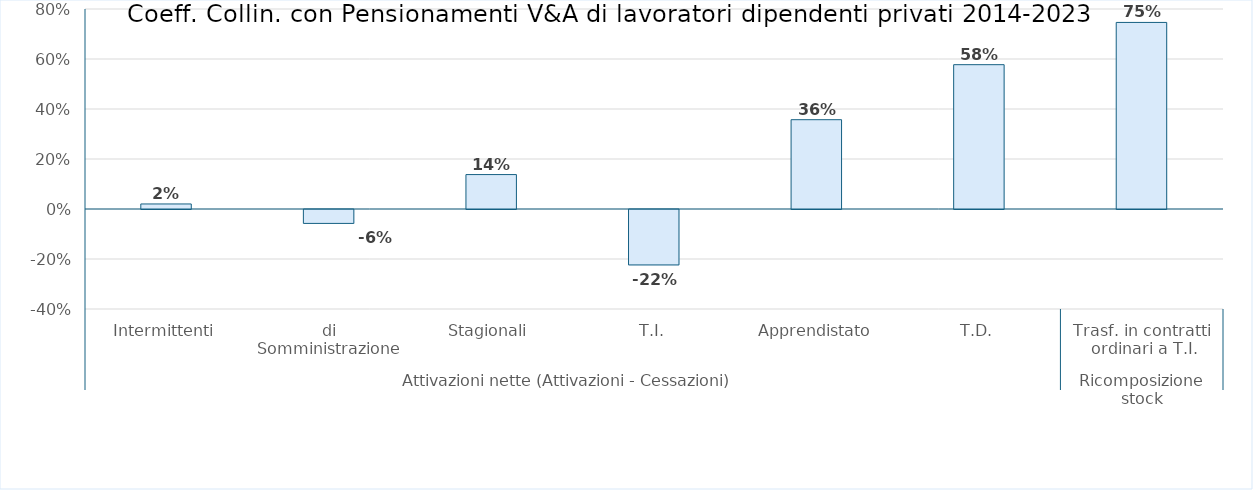
| Category | Coeff. Collin. con Pensionamenti V&A di lavoratori dipendenti privati |
|---|---|
| 0 | 0.02 |
| 1 | -0.056 |
| 2 | 0.138 |
| 3 | -0.222 |
| 4 | 0.357 |
| 5 | 0.577 |
| 6 | 0.746 |